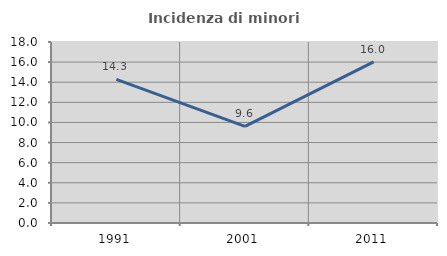
| Category | Incidenza di minori stranieri |
|---|---|
| 1991.0 | 14.286 |
| 2001.0 | 9.615 |
| 2011.0 | 16.031 |